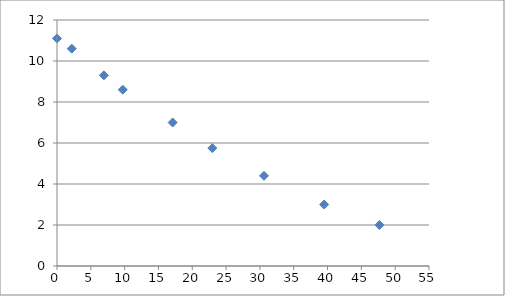
| Category | Series 0 |
|---|---|
| 0.0 | 11.1 |
| 2.1869999999999994 | 10.6 |
| 6.933 | 9.3 |
| 9.717 | 8.6 |
| 17.101999999999997 | 7 |
| 22.967999999999996 | 5.75 |
| 30.602999999999994 | 4.4 |
| 39.503 | 3 |
| 47.663 | 2 |